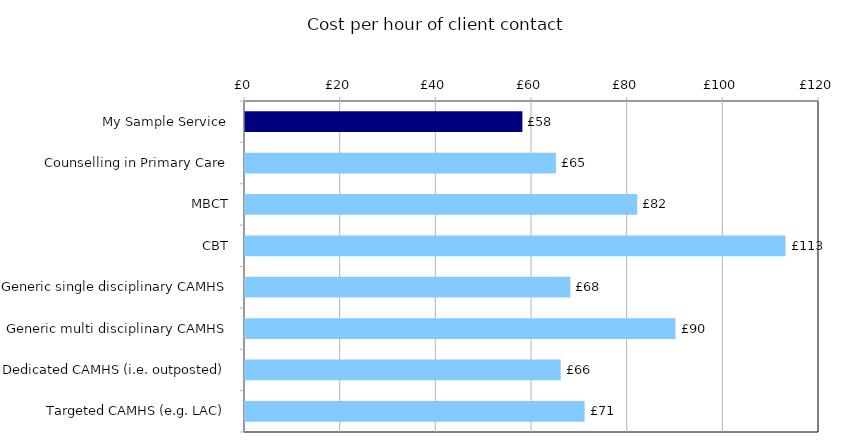
| Category | Series 0 |
|---|---|
| My Sample Service | 57.992 |
| Counselling in Primary Care | 65 |
| MBCT | 82 |
| CBT | 113 |
| Generic single disciplinary CAMHS | 68 |
| Generic multi disciplinary CAMHS | 90 |
| Dedicated CAMHS (i.e. outposted) | 66 |
| Targeted CAMHS (e.g. LAC) | 71 |